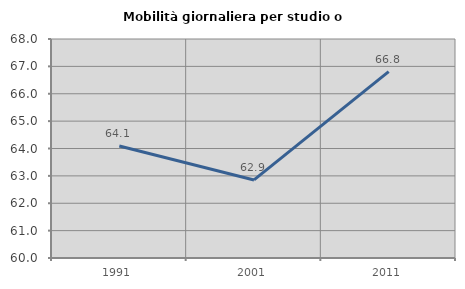
| Category | Mobilità giornaliera per studio o lavoro |
|---|---|
| 1991.0 | 64.09 |
| 2001.0 | 62.851 |
| 2011.0 | 66.811 |